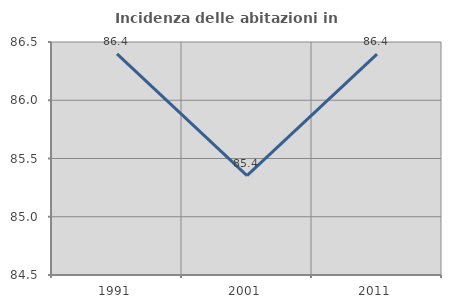
| Category | Incidenza delle abitazioni in proprietà  |
|---|---|
| 1991.0 | 86.398 |
| 2001.0 | 85.352 |
| 2011.0 | 86.396 |